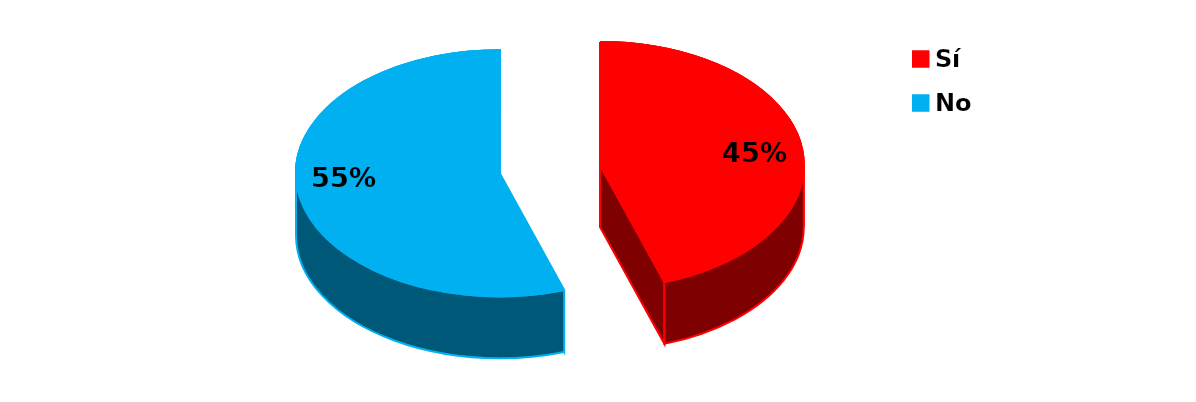
| Category | Series 0 |
|---|---|
| Sí | 57 |
| No | 70 |